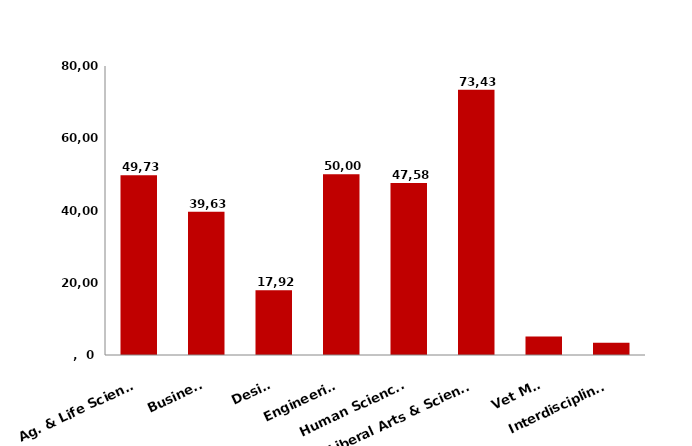
| Category | Series 0 |
|---|---|
| Ag. & Life Sciences | 49734 |
| Business | 39636 |
| Design | 17926 |
| Engineering | 50004 |
| Human Sciences | 47581 |
| Liberal Arts & Sciences | 73431 |
| Vet Med | 5153 |
| Interdisciplinary | 3362 |